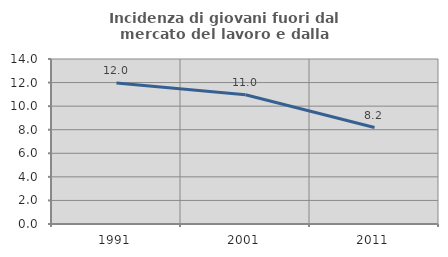
| Category | Incidenza di giovani fuori dal mercato del lavoro e dalla formazione  |
|---|---|
| 1991.0 | 11.968 |
| 2001.0 | 10.963 |
| 2011.0 | 8.187 |